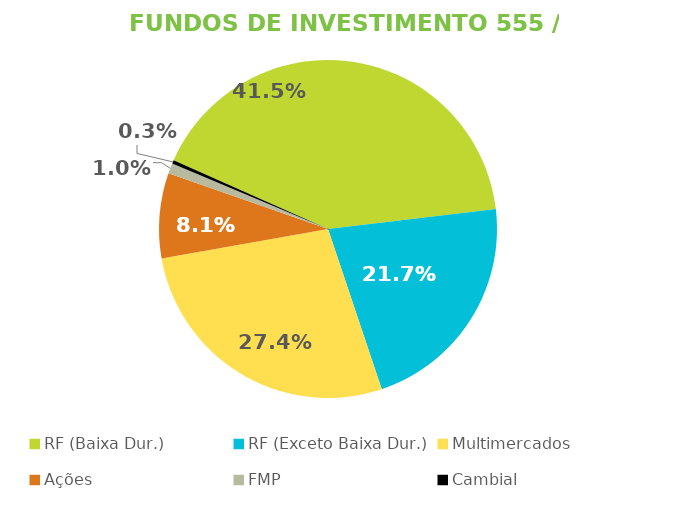
| Category | Fundos de Investimento 555 / FMP |
|---|---|
| RF (Baixa Dur.) | 0.415 |
| RF (Exceto Baixa Dur.) | 0.217 |
| Multimercados | 0.274 |
| Ações | 0.081 |
| FMP | 0.01 |
| Cambial | 0.003 |